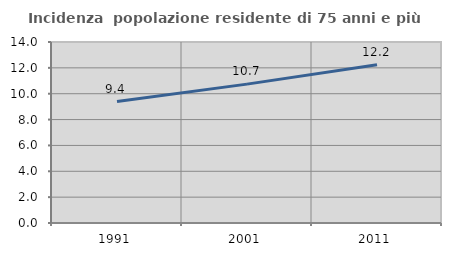
| Category | Incidenza  popolazione residente di 75 anni e più |
|---|---|
| 1991.0 | 9.389 |
| 2001.0 | 10.741 |
| 2011.0 | 12.233 |